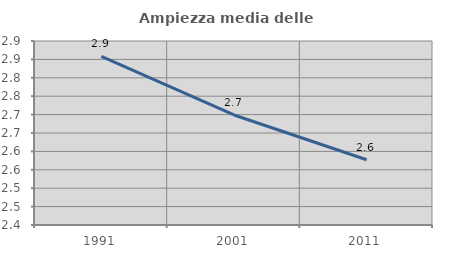
| Category | Ampiezza media delle famiglie |
|---|---|
| 1991.0 | 2.858 |
| 2001.0 | 2.699 |
| 2011.0 | 2.577 |